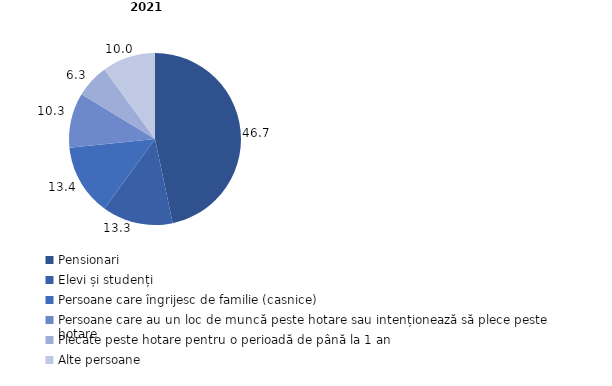
| Category | 2021 |
|---|---|
| Pensionari | 46.7 |
| Elevi și studenți | 13.3 |
| Persoane care îngrijesc de familie (casnice) | 13.4 |
| Persoane care au un loc de muncă peste hotare sau intenționează să plece peste hotare | 10.3 |
| Plecate peste hotare pentru o perioadă de până la 1 an | 6.3 |
| Alte persoane | 10 |